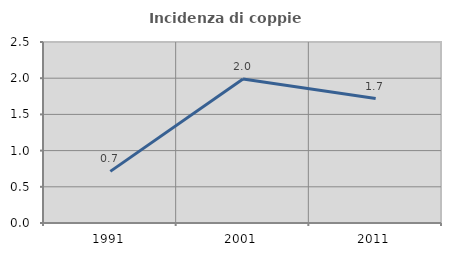
| Category | Incidenza di coppie miste |
|---|---|
| 1991.0 | 0.713 |
| 2001.0 | 1.989 |
| 2011.0 | 1.719 |